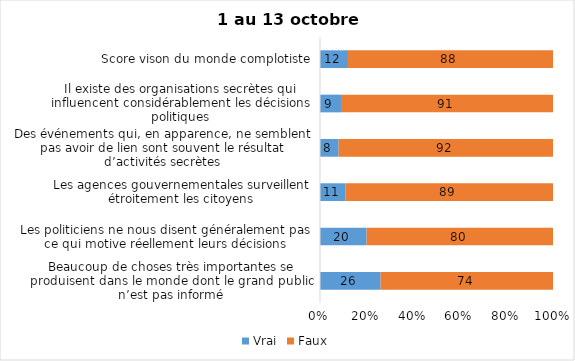
| Category | Vrai | Faux |
|---|---|---|
| Beaucoup de choses très importantes se produisent dans le monde dont le grand public n’est pas informé | 26 | 74 |
| Les politiciens ne nous disent généralement pas ce qui motive réellement leurs décisions | 20 | 80 |
| Les agences gouvernementales surveillent étroitement les citoyens | 11 | 89 |
| Des événements qui, en apparence, ne semblent pas avoir de lien sont souvent le résultat d’activités secrètes | 8 | 92 |
| Il existe des organisations secrètes qui influencent considérablement les décisions politiques | 9 | 91 |
| Score vison du monde complotiste | 12 | 88 |